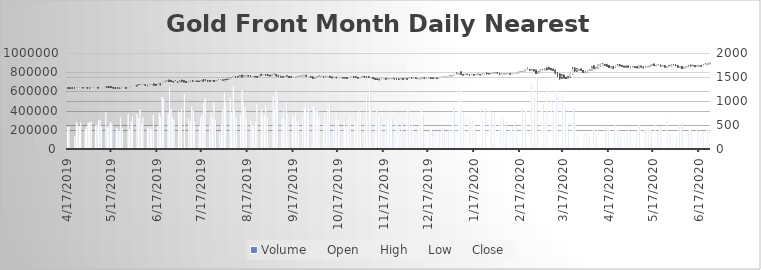
| Category | Volume |
|---|---|
| 4/17/19 | 223357 |
| 4/18/19 | 229629 |
| 4/22/19 | 136438 |
| 4/23/19 | 280344 |
| 4/24/19 | 246046 |
| 4/25/19 | 237154 |
| 4/26/19 | 278887 |
| 4/29/19 | 208956 |
| 4/30/19 | 239444 |
| 5/1/19 | 275425 |
| 5/2/19 | 282497 |
| 5/3/19 | 280323 |
| 5/6/19 | 244342 |
| 5/7/19 | 251087 |
| 5/8/19 | 302694 |
| 5/9/19 | 306546 |
| 5/10/19 | 238643 |
| 5/13/19 | 379440 |
| 5/14/19 | 222050 |
| 5/15/19 | 247522 |
| 5/16/19 | 282065 |
| 5/17/19 | 264569 |
| 5/20/19 | 212182 |
| 5/21/19 | 213168 |
| 5/22/19 | 191366 |
| 5/23/19 | 330160 |
| 5/24/19 | 218714 |
| 5/28/19 | 362163 |
| 5/29/19 | 201244 |
| 5/30/19 | 284019 |
| 5/31/19 | 341175 |
| 6/3/19 | 363396 |
| 6/4/19 | 319959 |
| 6/5/19 | 413470 |
| 6/6/19 | 263086 |
| 6/7/19 | 331289 |
| 6/10/19 | 228033 |
| 6/11/19 | 215146 |
| 6/12/19 | 234455 |
| 6/13/19 | 204827 |
| 6/14/19 | 358448 |
| 6/17/19 | 238707 |
| 6/18/19 | 376267 |
| 6/19/19 | 332611 |
| 6/20/19 | 542895 |
| 6/21/19 | 518888 |
| 6/24/19 | 375145 |
| 6/25/19 | 643590 |
| 6/26/19 | 421948 |
| 6/27/19 | 336359 |
| 6/28/19 | 306620 |
| 7/1/19 | 389761 |
| 7/2/19 | 383253 |
| 7/3/19 | 419609 |
| 7/5/19 | 577376 |
| 7/8/19 | 318692 |
| 7/9/19 | 287176 |
| 7/10/19 | 443496 |
| 7/11/19 | 400086 |
| 7/12/19 | 284967 |
| 7/15/19 | 243376 |
| 7/16/19 | 334818 |
| 7/17/19 | 358172 |
| 7/18/19 | 481325 |
| 7/19/19 | 530022 |
| 7/22/19 | 255354 |
| 7/23/19 | 386682 |
| 7/24/19 | 318164 |
| 7/25/19 | 489392 |
| 7/26/19 | 306018 |
| 7/29/19 | 174169 |
| 7/30/19 | 259623 |
| 7/31/19 | 419577 |
| 8/1/19 | 587561 |
| 8/2/19 | 493051 |
| 8/5/19 | 534188 |
| 8/6/19 | 381923 |
| 8/7/19 | 651548 |
| 8/8/19 | 402963 |
| 8/9/19 | 332605 |
| 8/12/19 | 355101 |
| 8/13/19 | 616740 |
| 8/14/19 | 484188 |
| 8/15/19 | 436117 |
| 8/16/19 | 322455 |
| 8/19/19 | 295828 |
| 8/20/19 | 247535 |
| 8/21/19 | 245896 |
| 8/22/19 | 279405 |
| 8/23/19 | 472999 |
| 8/26/19 | 411668 |
| 8/27/19 | 347046 |
| 8/28/19 | 353912 |
| 8/29/19 | 455595 |
| 8/30/19 | 330849 |
| 9/3/19 | 554833 |
| 9/4/19 | 412349 |
| 9/5/19 | 606398 |
| 9/6/19 | 544865 |
| 9/9/19 | 317523 |
| 9/10/19 | 397917 |
| 9/11/19 | 308791 |
| 9/12/19 | 491465 |
| 9/13/19 | 364417 |
| 9/16/19 | 349611 |
| 9/17/19 | 336627 |
| 9/18/19 | 364956 |
| 9/19/19 | 291302 |
| 9/20/19 | 284387 |
| 9/23/19 | 359879 |
| 9/24/19 | 424860 |
| 9/25/19 | 481457 |
| 9/26/19 | 378285 |
| 9/27/19 | 451928 |
| 9/30/19 | 439706 |
| 10/1/19 | 450174 |
| 10/2/19 | 393098 |
| 10/3/19 | 408743 |
| 10/4/19 | 344786 |
| 10/7/19 | 257779 |
| 10/8/19 | 371439 |
| 10/9/19 | 285278 |
| 10/10/19 | 417877 |
| 10/11/19 | 485955 |
| 10/14/19 | 228323 |
| 10/15/19 | 317991 |
| 10/16/19 | 367898 |
| 10/17/19 | 305666 |
| 10/18/19 | 232552 |
| 10/21/19 | 284292 |
| 10/22/19 | 208969 |
| 10/23/19 | 244615 |
| 10/24/19 | 305012 |
| 10/25/19 | 368743 |
| 10/28/19 | 318126 |
| 10/29/19 | 291980 |
| 10/30/19 | 353638 |
| 10/31/19 | 390013 |
| 11/1/19 | 380987 |
| 11/4/19 | 260197 |
| 11/5/19 | 593619 |
| 11/6/19 | 313719 |
| 11/7/19 | 674982 |
| 11/8/19 | 447069 |
| 11/11/19 | 310155 |
| 11/12/19 | 429612 |
| 11/13/19 | 352334 |
| 11/14/19 | 317400 |
| 11/15/19 | 251211 |
| 11/18/19 | 331235 |
| 11/19/19 | 307855 |
| 11/20/19 | 369970 |
| 11/21/19 | 388337 |
| 11/22/19 | 320504 |
| 11/25/19 | 298709 |
| 11/26/19 | 285632 |
| 11/27/19 | 232122 |
| 11/29/19 | 272344 |
| 12/2/19 | 316575 |
| 12/3/19 | 400899 |
| 12/4/19 | 319730 |
| 12/5/19 | 240014 |
| 12/6/19 | 317315 |
| 12/9/19 | 177222 |
| 12/10/19 | 228832 |
| 12/11/19 | 251732 |
| 12/12/19 | 409855 |
| 12/13/19 | 356682 |
| 12/16/19 | 165853 |
| 12/17/19 | 173253 |
| 12/18/19 | 197967 |
| 12/19/19 | 201186 |
| 12/20/19 | 140768 |
| 12/23/19 | 162446 |
| 12/24/19 | 183683 |
| 12/26/19 | 216614 |
| 12/27/19 | 204993 |
| 12/30/19 | 178722 |
| 12/31/19 | 220847 |
| 1/2/20 | 270546 |
| 1/3/20 | 436740 |
| 1/6/20 | 558969 |
| 1/7/20 | 435869 |
| 1/8/20 | 813406 |
| 1/9/20 | 372880 |
| 1/10/20 | 344342 |
| 1/13/20 | 311734 |
| 1/14/20 | 340913 |
| 1/15/20 | 310070 |
| 1/16/20 | 260054 |
| 1/17/20 | 264926 |
| 1/21/20 | 462622 |
| 1/22/20 | 286081 |
| 1/23/20 | 361025 |
| 1/24/20 | 427139 |
| 1/27/20 | 398058 |
| 1/28/20 | 378006 |
| 1/29/20 | 238019 |
| 1/30/20 | 382595 |
| 1/31/20 | 343366 |
| 2/3/20 | 320599 |
| 2/4/20 | 349002 |
| 2/5/20 | 306051 |
| 2/6/20 | 229003 |
| 2/7/20 | 286422 |
| 2/10/20 | 191752 |
| 2/11/20 | 231832 |
| 2/12/20 | 189550 |
| 2/13/20 | 276252 |
| 2/14/20 | 227109 |
| 2/18/20 | 414235 |
| 2/19/20 | 307885 |
| 2/20/20 | 403039 |
| 2/21/20 | 489193 |
| 2/24/20 | 680823 |
| 2/25/20 | 672758 |
| 2/26/20 | 531901 |
| 2/27/20 | 573289 |
| 2/28/20 | 745843 |
| 3/2/20 | 443528 |
| 3/3/20 | 466533 |
| 3/4/20 | 313344 |
| 3/5/20 | 362995 |
| 3/6/20 | 659625 |
| 3/9/20 | 504155 |
| 3/10/20 | 385479 |
| 3/11/20 | 404351 |
| 3/12/20 | 605721 |
| 3/13/20 | 551049 |
| 3/16/20 | 565977 |
| 3/17/20 | 434508 |
| 3/18/20 | 435187 |
| 3/19/20 | 325286 |
| 3/20/20 | 269974 |
| 3/23/20 | 362068 |
| 3/24/20 | 418776 |
| 3/25/20 | 254189 |
| 3/26/20 | 145429 |
| 3/27/20 | 159263 |
| 3/30/20 | 157366 |
| 3/31/20 | 176554 |
| 4/1/20 | 164482 |
| 4/2/20 | 167707 |
| 4/3/20 | 139612 |
| 4/6/20 | 192753 |
| 4/7/20 | 204497 |
| 4/8/20 | 125327 |
| 4/9/20 | 218804 |
| 4/13/20 | 166890 |
| 4/14/20 | 241194 |
| 4/15/20 | 186697 |
| 4/16/20 | 204225 |
| 4/17/20 | 227069 |
| 4/20/20 | 186912 |
| 4/21/20 | 248629 |
| 4/22/20 | 193728 |
| 4/23/20 | 201884 |
| 4/24/20 | 180242 |
| 4/27/20 | 146641 |
| 4/28/20 | 171343 |
| 4/29/20 | 159603 |
| 4/30/20 | 234529 |
| 5/1/20 | 168016 |
| 5/4/20 | 148728 |
| 5/5/20 | 184728 |
| 5/6/20 | 203370 |
| 5/7/20 | 250704 |
| 5/8/20 | 232810 |
| 5/11/20 | 202173 |
| 5/12/20 | 198067 |
| 5/13/20 | 211614 |
| 5/14/20 | 212914 |
| 5/15/20 | 200179 |
| 5/18/20 | 271472 |
| 5/19/20 | 185258 |
| 5/20/20 | 184460 |
| 5/21/20 | 238735 |
| 5/22/20 | 196816 |
| 5/26/20 | 313174 |
| 5/27/20 | 158952 |
| 5/28/20 | 164817 |
| 5/29/20 | 150112 |
| 6/1/20 | 146131 |
| 6/2/20 | 175351 |
| 6/3/20 | 256523 |
| 6/4/20 | 198723 |
| 6/5/20 | 273683 |
| 6/8/20 | 154767 |
| 6/9/20 | 182910 |
| 6/10/20 | 198763 |
| 6/11/20 | 205348 |
| 6/12/20 | 151397 |
| 6/15/20 | 200225 |
| 6/16/20 | 182423 |
| 6/17/20 | 140069 |
| 6/18/20 | 155912 |
| 6/19/20 | 181151 |
| 6/22/20 | 228682 |
| 6/23/20 | 194678 |
| 6/24/20 | 144837 |